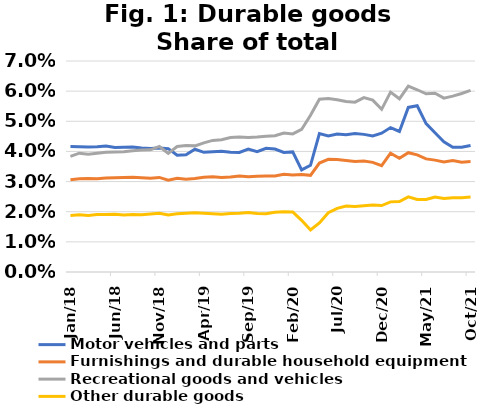
| Category | Motor vehicles and parts | Furnishings and durable household equipment | Recreational goods and vehicles | Other durable goods |
|---|---|---|---|---|
| 2018-01-01 | 0.042 | 0.031 | 0.038 | 0.019 |
| 2018-02-01 | 0.042 | 0.031 | 0.039 | 0.019 |
| 2018-03-01 | 0.041 | 0.031 | 0.039 | 0.019 |
| 2018-04-01 | 0.042 | 0.031 | 0.039 | 0.019 |
| 2018-05-01 | 0.042 | 0.031 | 0.04 | 0.019 |
| 2018-06-01 | 0.041 | 0.031 | 0.04 | 0.019 |
| 2018-07-01 | 0.041 | 0.031 | 0.04 | 0.019 |
| 2018-08-01 | 0.041 | 0.031 | 0.04 | 0.019 |
| 2018-09-01 | 0.041 | 0.031 | 0.04 | 0.019 |
| 2018-10-01 | 0.041 | 0.031 | 0.041 | 0.019 |
| 2018-11-01 | 0.041 | 0.031 | 0.042 | 0.02 |
| 2018-12-01 | 0.041 | 0.03 | 0.039 | 0.019 |
| 2019-01-01 | 0.039 | 0.031 | 0.042 | 0.019 |
| 2019-02-01 | 0.039 | 0.031 | 0.042 | 0.02 |
| 2019-03-01 | 0.041 | 0.031 | 0.042 | 0.02 |
| 2019-04-01 | 0.04 | 0.031 | 0.043 | 0.019 |
| 2019-05-01 | 0.04 | 0.032 | 0.044 | 0.019 |
| 2019-06-01 | 0.04 | 0.031 | 0.044 | 0.019 |
| 2019-07-01 | 0.04 | 0.032 | 0.045 | 0.019 |
| 2019-08-01 | 0.04 | 0.032 | 0.045 | 0.02 |
| 2019-09-01 | 0.041 | 0.032 | 0.045 | 0.02 |
| 2019-10-01 | 0.04 | 0.032 | 0.045 | 0.019 |
| 2019-11-01 | 0.041 | 0.032 | 0.045 | 0.019 |
| 2019-12-01 | 0.041 | 0.032 | 0.045 | 0.02 |
| 2020-01-01 | 0.04 | 0.032 | 0.046 | 0.02 |
| 2020-02-01 | 0.04 | 0.032 | 0.046 | 0.02 |
| 2020-03-01 | 0.034 | 0.032 | 0.047 | 0.017 |
| 2020-04-01 | 0.035 | 0.032 | 0.052 | 0.014 |
| 2020-05-01 | 0.046 | 0.036 | 0.057 | 0.016 |
| 2020-06-01 | 0.045 | 0.037 | 0.058 | 0.02 |
| 2020-07-01 | 0.046 | 0.037 | 0.057 | 0.021 |
| 2020-08-01 | 0.046 | 0.037 | 0.057 | 0.022 |
| 2020-09-01 | 0.046 | 0.037 | 0.056 | 0.022 |
| 2020-10-01 | 0.046 | 0.037 | 0.058 | 0.022 |
| 2020-11-01 | 0.045 | 0.036 | 0.057 | 0.022 |
| 2020-12-01 | 0.046 | 0.035 | 0.054 | 0.022 |
| 2021-01-01 | 0.048 | 0.039 | 0.06 | 0.023 |
| 2021-02-01 | 0.047 | 0.038 | 0.057 | 0.023 |
| 2021-03-01 | 0.055 | 0.04 | 0.062 | 0.025 |
| 2021-04-01 | 0.055 | 0.039 | 0.06 | 0.024 |
| 2021-05-01 | 0.049 | 0.038 | 0.059 | 0.024 |
| 2021-06-01 | 0.046 | 0.037 | 0.059 | 0.025 |
| 2021-07-01 | 0.043 | 0.036 | 0.058 | 0.024 |
| 2021-08-01 | 0.041 | 0.037 | 0.058 | 0.025 |
| 2021-09-01 | 0.041 | 0.036 | 0.059 | 0.025 |
| 2021-10-01 | 0.042 | 0.037 | 0.06 | 0.025 |